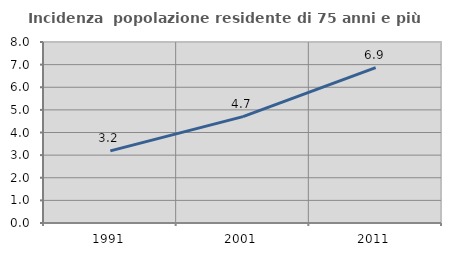
| Category | Incidenza  popolazione residente di 75 anni e più |
|---|---|
| 1991.0 | 3.19 |
| 2001.0 | 4.703 |
| 2011.0 | 6.871 |